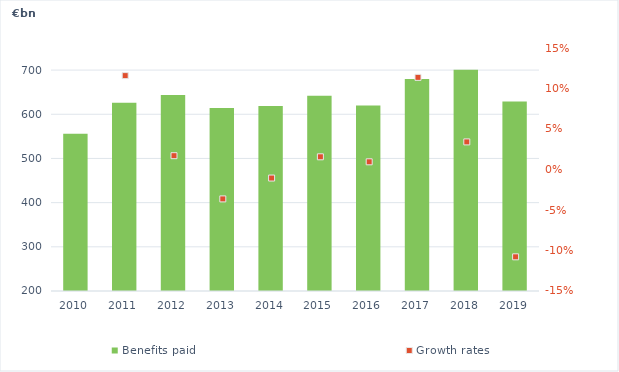
| Category | Benefits paid |
|---|---|
| 2010.0 | 556.015 |
| 2011.0 | 626.16 |
| 2012.0 | 643.741 |
| 2013.0 | 614.478 |
| 2014.0 | 618.829 |
| 2015.0 | 642.167 |
| 2016.0 | 619.843 |
| 2017.0 | 679.915 |
| 2018.0 | 700.548 |
| 2019.0 | 628.809 |